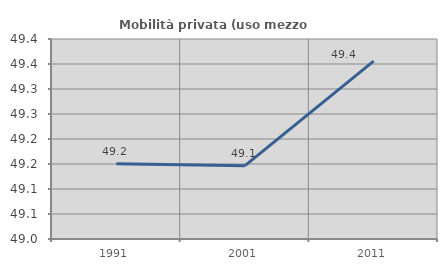
| Category | Mobilità privata (uso mezzo privato) |
|---|---|
| 1991.0 | 49.15 |
| 2001.0 | 49.147 |
| 2011.0 | 49.356 |